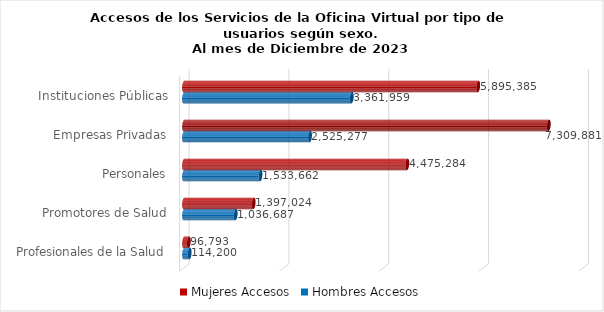
| Category | Mujeres | Hombres |
|---|---|---|
| Instituciones Públicas | 5895385 | 3361959 |
| Empresas Privadas | 7309881 | 2525277 |
| Personales | 4475284 | 1533662 |
| Promotores de Salud | 1397024 | 1036687 |
| Profesionales de la Salud | 96793 | 114200 |